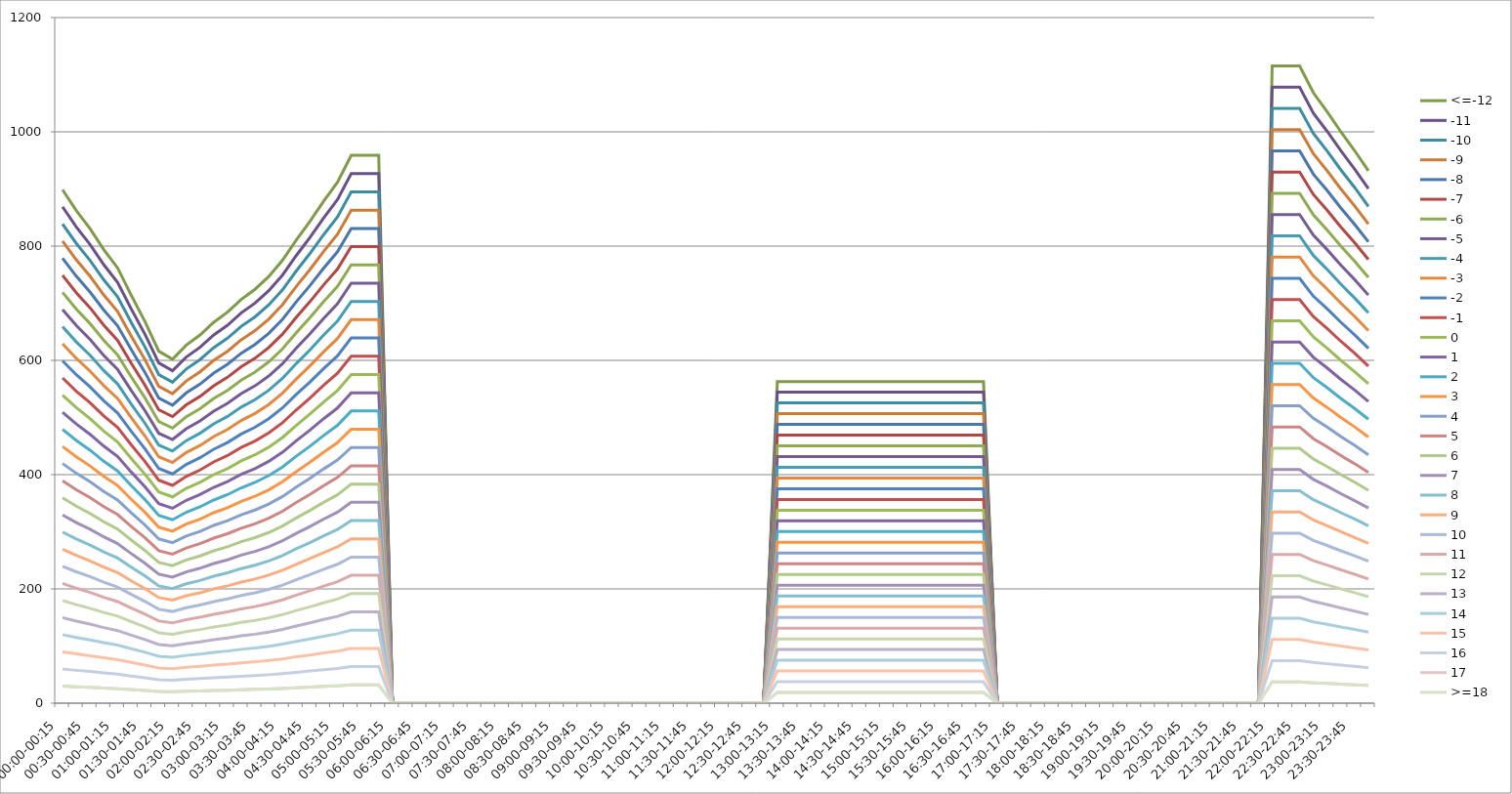
| Category | <=-12 | -11 | -10 | -9 | -8 | -7 | -6 | -5 | -4 | -3 | -2 | -1 | 0 | 1 | 2 | 3 | 4 | 5 | 6 | 7 | 8 | 9 | 10 | 11 | 12 | 13 | 14 | 15 | 16 | 17 | >=18 |
|---|---|---|---|---|---|---|---|---|---|---|---|---|---|---|---|---|---|---|---|---|---|---|---|---|---|---|---|---|---|---|---|
| 00:00-00:15 | 898.734 | 868.776 | 838.818 | 808.86 | 778.903 | 748.945 | 718.987 | 689.029 | 659.071 | 629.114 | 599.156 | 569.198 | 539.24 | 509.282 | 479.325 | 449.367 | 419.409 | 389.451 | 359.494 | 329.536 | 299.578 | 269.62 | 239.662 | 209.705 | 179.747 | 149.789 | 119.831 | 89.873 | 59.916 | 29.958 | 29.958 |
| 00:15-00:30 | 862.219 | 833.478 | 804.738 | 775.997 | 747.256 | 718.516 | 689.775 | 661.035 | 632.294 | 603.553 | 574.813 | 546.072 | 517.331 | 488.591 | 459.85 | 431.11 | 402.369 | 373.628 | 344.888 | 316.147 | 287.406 | 258.666 | 229.925 | 201.184 | 172.444 | 143.703 | 114.963 | 86.222 | 57.481 | 28.741 | 28.741 |
| 00:30-00:45 | 830.416 | 802.735 | 775.055 | 747.374 | 719.694 | 692.013 | 664.333 | 636.652 | 608.972 | 581.291 | 553.611 | 525.93 | 498.25 | 470.569 | 442.888 | 415.208 | 387.527 | 359.847 | 332.166 | 304.486 | 276.805 | 249.125 | 221.444 | 193.764 | 166.083 | 138.403 | 110.722 | 83.042 | 55.361 | 27.681 | 27.681 |
| 00:45-01:00 | 793.901 | 767.438 | 740.974 | 714.511 | 688.048 | 661.584 | 635.121 | 608.658 | 582.194 | 555.731 | 529.267 | 502.804 | 476.341 | 449.877 | 423.414 | 396.951 | 370.487 | 344.024 | 317.56 | 291.097 | 264.634 | 238.17 | 211.707 | 185.244 | 158.78 | 132.317 | 105.853 | 79.39 | 52.927 | 26.463 | 26.463 |
| 01:00-01:15 | 762.098 | 736.695 | 711.291 | 685.888 | 660.485 | 635.082 | 609.678 | 584.275 | 558.872 | 533.469 | 508.065 | 482.662 | 457.259 | 431.856 | 406.452 | 381.049 | 355.646 | 330.242 | 304.839 | 279.436 | 254.033 | 228.629 | 203.226 | 177.823 | 152.42 | 127.016 | 101.613 | 76.21 | 50.807 | 25.403 | 25.403 |
| 01:15-01:30 | 713.804 | 690.011 | 666.217 | 642.424 | 618.63 | 594.837 | 571.043 | 547.25 | 523.456 | 499.663 | 475.87 | 452.076 | 428.283 | 404.489 | 380.696 | 356.902 | 333.109 | 309.315 | 285.522 | 261.728 | 237.935 | 214.141 | 190.348 | 166.554 | 142.761 | 118.967 | 95.174 | 71.38 | 47.587 | 23.793 | 23.793 |
| 01:30-01:45 | 667.866 | 645.604 | 623.342 | 601.08 | 578.818 | 556.555 | 534.293 | 512.031 | 489.769 | 467.506 | 445.244 | 422.982 | 400.72 | 378.458 | 356.195 | 333.933 | 311.671 | 289.409 | 267.147 | 244.884 | 222.622 | 200.36 | 178.098 | 155.835 | 133.573 | 111.311 | 89.049 | 66.787 | 44.524 | 22.262 | 22.262 |
| 01:45-02:00 | 616.039 | 595.504 | 574.97 | 554.435 | 533.9 | 513.366 | 492.831 | 472.297 | 451.762 | 431.227 | 410.693 | 390.158 | 369.623 | 349.089 | 328.554 | 308.02 | 287.485 | 266.95 | 246.416 | 225.881 | 205.346 | 184.812 | 164.277 | 143.742 | 123.208 | 102.673 | 82.139 | 61.604 | 41.069 | 20.535 | 20.535 |
| 02:00-02:15 | 601.904 | 581.841 | 561.777 | 541.714 | 521.65 | 501.587 | 481.523 | 461.46 | 441.396 | 421.333 | 401.27 | 381.206 | 361.143 | 341.079 | 321.016 | 300.952 | 280.889 | 260.825 | 240.762 | 220.698 | 200.635 | 180.571 | 160.508 | 140.444 | 120.381 | 100.317 | 80.254 | 60.19 | 40.127 | 20.063 | 20.063 |
| 02:15-02:30 | 626.64 | 605.752 | 584.864 | 563.976 | 543.088 | 522.2 | 501.312 | 480.424 | 459.536 | 438.648 | 417.76 | 396.872 | 375.984 | 355.096 | 334.208 | 313.32 | 292.432 | 271.544 | 250.656 | 229.768 | 208.88 | 187.992 | 167.104 | 146.216 | 125.328 | 104.44 | 83.552 | 62.664 | 41.776 | 20.888 | 20.888 |
| 02:30-02:45 | 644.308 | 622.832 | 601.355 | 579.878 | 558.401 | 536.924 | 515.447 | 493.97 | 472.493 | 451.016 | 429.539 | 408.062 | 386.585 | 365.108 | 343.631 | 322.154 | 300.677 | 279.2 | 257.723 | 236.246 | 214.769 | 193.293 | 171.816 | 150.339 | 128.862 | 107.385 | 85.908 | 64.431 | 42.954 | 21.477 | 21.477 |
| 02:45-03:00 | 666.688 | 644.466 | 622.243 | 600.02 | 577.797 | 555.574 | 533.351 | 511.128 | 488.905 | 466.682 | 444.459 | 422.236 | 400.013 | 377.79 | 355.567 | 333.344 | 311.121 | 288.898 | 266.675 | 244.452 | 222.229 | 200.007 | 177.784 | 155.561 | 133.338 | 111.115 | 88.892 | 66.669 | 44.446 | 22.223 | 22.223 |
| 03:00-03:15 | 684.357 | 661.545 | 638.733 | 615.921 | 593.109 | 570.297 | 547.486 | 524.674 | 501.862 | 479.05 | 456.238 | 433.426 | 410.614 | 387.802 | 364.99 | 342.178 | 319.367 | 296.555 | 273.743 | 250.931 | 228.119 | 205.307 | 182.495 | 159.683 | 136.871 | 114.059 | 91.248 | 68.436 | 45.624 | 22.812 | 22.812 |
| 03:15-03:30 | 706.737 | 683.179 | 659.621 | 636.063 | 612.505 | 588.947 | 565.39 | 541.832 | 518.274 | 494.716 | 471.158 | 447.6 | 424.042 | 400.484 | 376.926 | 353.368 | 329.811 | 306.253 | 282.695 | 259.137 | 235.579 | 212.021 | 188.463 | 164.905 | 141.347 | 117.789 | 94.232 | 70.674 | 47.116 | 23.558 | 23.558 |
| 03:30-03:45 | 724.405 | 700.258 | 676.112 | 651.965 | 627.818 | 603.671 | 579.524 | 555.377 | 531.231 | 507.084 | 482.937 | 458.79 | 434.643 | 410.496 | 386.35 | 362.203 | 338.056 | 313.909 | 289.762 | 265.615 | 241.468 | 217.322 | 193.175 | 169.028 | 144.881 | 120.734 | 96.587 | 72.441 | 48.294 | 24.147 | 24.147 |
| 03:45-04:00 | 746.785 | 721.892 | 697 | 672.107 | 647.214 | 622.321 | 597.428 | 572.535 | 547.643 | 522.75 | 497.857 | 472.964 | 448.071 | 423.178 | 398.286 | 373.393 | 348.5 | 323.607 | 298.714 | 273.821 | 248.928 | 224.036 | 199.143 | 174.25 | 149.357 | 124.464 | 99.571 | 74.679 | 49.786 | 24.893 | 24.893 |
| 04:00-04:15 | 775.055 | 749.22 | 723.384 | 697.549 | 671.714 | 645.879 | 620.044 | 594.209 | 568.374 | 542.538 | 516.703 | 490.868 | 465.033 | 439.198 | 413.363 | 387.527 | 361.692 | 335.857 | 310.022 | 284.187 | 258.352 | 232.516 | 206.681 | 180.846 | 155.011 | 129.176 | 103.341 | 77.505 | 51.67 | 25.835 | 25.835 |
| 04:15-04:30 | 810.392 | 783.379 | 756.366 | 729.352 | 702.339 | 675.326 | 648.313 | 621.3 | 594.287 | 567.274 | 540.261 | 513.248 | 486.235 | 459.222 | 432.209 | 405.196 | 378.183 | 351.17 | 324.157 | 297.144 | 270.131 | 243.117 | 216.104 | 189.091 | 162.078 | 135.065 | 108.052 | 81.039 | 54.026 | 27.013 | 27.013 |
| 04:30-04:45 | 843.373 | 815.26 | 787.148 | 759.035 | 730.923 | 702.811 | 674.698 | 646.586 | 618.473 | 590.361 | 562.248 | 534.136 | 506.024 | 477.911 | 449.799 | 421.686 | 393.574 | 365.462 | 337.349 | 309.237 | 281.124 | 253.012 | 224.899 | 196.787 | 168.675 | 140.562 | 112.45 | 84.337 | 56.225 | 28.112 | 28.112 |
| 04:45-05:00 | 878.71 | 849.419 | 820.129 | 790.839 | 761.548 | 732.258 | 702.968 | 673.677 | 644.387 | 615.097 | 585.806 | 556.516 | 527.226 | 497.935 | 468.645 | 439.355 | 410.064 | 380.774 | 351.484 | 322.194 | 292.903 | 263.613 | 234.323 | 205.032 | 175.742 | 146.452 | 117.161 | 87.871 | 58.581 | 29.29 | 29.29 |
| 05:00-05:15 | 911.691 | 881.301 | 850.911 | 820.522 | 790.132 | 759.742 | 729.352 | 698.963 | 668.573 | 638.183 | 607.794 | 577.404 | 547.014 | 516.625 | 486.235 | 455.845 | 425.456 | 395.066 | 364.676 | 334.287 | 303.897 | 273.507 | 243.117 | 212.728 | 182.338 | 151.948 | 121.559 | 91.169 | 60.779 | 30.39 | 30.39 |
| 05:15-05:30 | 958.806 | 926.846 | 894.886 | 862.926 | 830.966 | 799.005 | 767.045 | 735.085 | 703.125 | 671.164 | 639.204 | 607.244 | 575.284 | 543.324 | 511.363 | 479.403 | 447.443 | 415.483 | 383.523 | 351.562 | 319.602 | 287.642 | 255.682 | 223.721 | 191.761 | 159.801 | 127.841 | 95.881 | 63.92 | 31.96 | 31.96 |
| 05:30-05:45 | 958.806 | 926.846 | 894.886 | 862.926 | 830.966 | 799.005 | 767.045 | 735.085 | 703.125 | 671.164 | 639.204 | 607.244 | 575.284 | 543.324 | 511.363 | 479.403 | 447.443 | 415.483 | 383.523 | 351.562 | 319.602 | 287.642 | 255.682 | 223.721 | 191.761 | 159.801 | 127.841 | 95.881 | 63.92 | 31.96 | 31.96 |
| 05:45-06:00 | 958.806 | 926.846 | 894.886 | 862.926 | 830.966 | 799.005 | 767.045 | 735.085 | 703.125 | 671.164 | 639.204 | 607.244 | 575.284 | 543.324 | 511.363 | 479.403 | 447.443 | 415.483 | 383.523 | 351.562 | 319.602 | 287.642 | 255.682 | 223.721 | 191.761 | 159.801 | 127.841 | 95.881 | 63.92 | 31.96 | 31.96 |
| 06:00-06:15 | 0 | 0 | 0 | 0 | 0 | 0 | 0 | 0 | 0 | 0 | 0 | 0 | 0 | 0 | 0 | 0 | 0 | 0 | 0 | 0 | 0 | 0 | 0 | 0 | 0 | 0 | 0 | 0 | 0 | 0 | 0 |
| 06:15-06:30 | 0 | 0 | 0 | 0 | 0 | 0 | 0 | 0 | 0 | 0 | 0 | 0 | 0 | 0 | 0 | 0 | 0 | 0 | 0 | 0 | 0 | 0 | 0 | 0 | 0 | 0 | 0 | 0 | 0 | 0 | 0 |
| 06:30-06:45 | 0 | 0 | 0 | 0 | 0 | 0 | 0 | 0 | 0 | 0 | 0 | 0 | 0 | 0 | 0 | 0 | 0 | 0 | 0 | 0 | 0 | 0 | 0 | 0 | 0 | 0 | 0 | 0 | 0 | 0 | 0 |
| 06:45-07:00 | 0 | 0 | 0 | 0 | 0 | 0 | 0 | 0 | 0 | 0 | 0 | 0 | 0 | 0 | 0 | 0 | 0 | 0 | 0 | 0 | 0 | 0 | 0 | 0 | 0 | 0 | 0 | 0 | 0 | 0 | 0 |
| 07:00-07:15 | 0 | 0 | 0 | 0 | 0 | 0 | 0 | 0 | 0 | 0 | 0 | 0 | 0 | 0 | 0 | 0 | 0 | 0 | 0 | 0 | 0 | 0 | 0 | 0 | 0 | 0 | 0 | 0 | 0 | 0 | 0 |
| 07:15-07:30 | 0 | 0 | 0 | 0 | 0 | 0 | 0 | 0 | 0 | 0 | 0 | 0 | 0 | 0 | 0 | 0 | 0 | 0 | 0 | 0 | 0 | 0 | 0 | 0 | 0 | 0 | 0 | 0 | 0 | 0 | 0 |
| 07:30-07:45 | 0 | 0 | 0 | 0 | 0 | 0 | 0 | 0 | 0 | 0 | 0 | 0 | 0 | 0 | 0 | 0 | 0 | 0 | 0 | 0 | 0 | 0 | 0 | 0 | 0 | 0 | 0 | 0 | 0 | 0 | 0 |
| 07:45-08:00 | 0 | 0 | 0 | 0 | 0 | 0 | 0 | 0 | 0 | 0 | 0 | 0 | 0 | 0 | 0 | 0 | 0 | 0 | 0 | 0 | 0 | 0 | 0 | 0 | 0 | 0 | 0 | 0 | 0 | 0 | 0 |
| 08:00-08:15 | 0 | 0 | 0 | 0 | 0 | 0 | 0 | 0 | 0 | 0 | 0 | 0 | 0 | 0 | 0 | 0 | 0 | 0 | 0 | 0 | 0 | 0 | 0 | 0 | 0 | 0 | 0 | 0 | 0 | 0 | 0 |
| 08:15-08:30 | 0 | 0 | 0 | 0 | 0 | 0 | 0 | 0 | 0 | 0 | 0 | 0 | 0 | 0 | 0 | 0 | 0 | 0 | 0 | 0 | 0 | 0 | 0 | 0 | 0 | 0 | 0 | 0 | 0 | 0 | 0 |
| 08:30-08:45 | 0 | 0 | 0 | 0 | 0 | 0 | 0 | 0 | 0 | 0 | 0 | 0 | 0 | 0 | 0 | 0 | 0 | 0 | 0 | 0 | 0 | 0 | 0 | 0 | 0 | 0 | 0 | 0 | 0 | 0 | 0 |
| 08:45-09:00 | 0 | 0 | 0 | 0 | 0 | 0 | 0 | 0 | 0 | 0 | 0 | 0 | 0 | 0 | 0 | 0 | 0 | 0 | 0 | 0 | 0 | 0 | 0 | 0 | 0 | 0 | 0 | 0 | 0 | 0 | 0 |
| 09:00-09:15 | 0 | 0 | 0 | 0 | 0 | 0 | 0 | 0 | 0 | 0 | 0 | 0 | 0 | 0 | 0 | 0 | 0 | 0 | 0 | 0 | 0 | 0 | 0 | 0 | 0 | 0 | 0 | 0 | 0 | 0 | 0 |
| 09:15-09:30 | 0 | 0 | 0 | 0 | 0 | 0 | 0 | 0 | 0 | 0 | 0 | 0 | 0 | 0 | 0 | 0 | 0 | 0 | 0 | 0 | 0 | 0 | 0 | 0 | 0 | 0 | 0 | 0 | 0 | 0 | 0 |
| 09:30-09:45 | 0 | 0 | 0 | 0 | 0 | 0 | 0 | 0 | 0 | 0 | 0 | 0 | 0 | 0 | 0 | 0 | 0 | 0 | 0 | 0 | 0 | 0 | 0 | 0 | 0 | 0 | 0 | 0 | 0 | 0 | 0 |
| 09:45-10:00 | 0 | 0 | 0 | 0 | 0 | 0 | 0 | 0 | 0 | 0 | 0 | 0 | 0 | 0 | 0 | 0 | 0 | 0 | 0 | 0 | 0 | 0 | 0 | 0 | 0 | 0 | 0 | 0 | 0 | 0 | 0 |
| 10:00-10:15 | 0 | 0 | 0 | 0 | 0 | 0 | 0 | 0 | 0 | 0 | 0 | 0 | 0 | 0 | 0 | 0 | 0 | 0 | 0 | 0 | 0 | 0 | 0 | 0 | 0 | 0 | 0 | 0 | 0 | 0 | 0 |
| 10:15-10:30 | 0 | 0 | 0 | 0 | 0 | 0 | 0 | 0 | 0 | 0 | 0 | 0 | 0 | 0 | 0 | 0 | 0 | 0 | 0 | 0 | 0 | 0 | 0 | 0 | 0 | 0 | 0 | 0 | 0 | 0 | 0 |
| 10:30-10:45 | 0 | 0 | 0 | 0 | 0 | 0 | 0 | 0 | 0 | 0 | 0 | 0 | 0 | 0 | 0 | 0 | 0 | 0 | 0 | 0 | 0 | 0 | 0 | 0 | 0 | 0 | 0 | 0 | 0 | 0 | 0 |
| 10:45-11:00 | 0 | 0 | 0 | 0 | 0 | 0 | 0 | 0 | 0 | 0 | 0 | 0 | 0 | 0 | 0 | 0 | 0 | 0 | 0 | 0 | 0 | 0 | 0 | 0 | 0 | 0 | 0 | 0 | 0 | 0 | 0 |
| 11:00-11:15 | 0 | 0 | 0 | 0 | 0 | 0 | 0 | 0 | 0 | 0 | 0 | 0 | 0 | 0 | 0 | 0 | 0 | 0 | 0 | 0 | 0 | 0 | 0 | 0 | 0 | 0 | 0 | 0 | 0 | 0 | 0 |
| 11:15-11:30 | 0 | 0 | 0 | 0 | 0 | 0 | 0 | 0 | 0 | 0 | 0 | 0 | 0 | 0 | 0 | 0 | 0 | 0 | 0 | 0 | 0 | 0 | 0 | 0 | 0 | 0 | 0 | 0 | 0 | 0 | 0 |
| 11:30-11:45 | 0 | 0 | 0 | 0 | 0 | 0 | 0 | 0 | 0 | 0 | 0 | 0 | 0 | 0 | 0 | 0 | 0 | 0 | 0 | 0 | 0 | 0 | 0 | 0 | 0 | 0 | 0 | 0 | 0 | 0 | 0 |
| 11:45-12:00 | 0 | 0 | 0 | 0 | 0 | 0 | 0 | 0 | 0 | 0 | 0 | 0 | 0 | 0 | 0 | 0 | 0 | 0 | 0 | 0 | 0 | 0 | 0 | 0 | 0 | 0 | 0 | 0 | 0 | 0 | 0 |
| 12:00-12:15 | 0 | 0 | 0 | 0 | 0 | 0 | 0 | 0 | 0 | 0 | 0 | 0 | 0 | 0 | 0 | 0 | 0 | 0 | 0 | 0 | 0 | 0 | 0 | 0 | 0 | 0 | 0 | 0 | 0 | 0 | 0 |
| 12:15-12:30 | 0 | 0 | 0 | 0 | 0 | 0 | 0 | 0 | 0 | 0 | 0 | 0 | 0 | 0 | 0 | 0 | 0 | 0 | 0 | 0 | 0 | 0 | 0 | 0 | 0 | 0 | 0 | 0 | 0 | 0 | 0 |
| 12:30-12:45 | 0 | 0 | 0 | 0 | 0 | 0 | 0 | 0 | 0 | 0 | 0 | 0 | 0 | 0 | 0 | 0 | 0 | 0 | 0 | 0 | 0 | 0 | 0 | 0 | 0 | 0 | 0 | 0 | 0 | 0 | 0 |
| 12:45-13:00 | 0 | 0 | 0 | 0 | 0 | 0 | 0 | 0 | 0 | 0 | 0 | 0 | 0 | 0 | 0 | 0 | 0 | 0 | 0 | 0 | 0 | 0 | 0 | 0 | 0 | 0 | 0 | 0 | 0 | 0 | 0 |
| 13:00-13:15 | 563.034 | 544.266 | 525.498 | 506.73 | 487.963 | 469.195 | 450.427 | 431.659 | 412.891 | 394.124 | 375.356 | 356.588 | 337.82 | 319.052 | 300.285 | 281.517 | 262.749 | 243.981 | 225.213 | 206.446 | 187.678 | 168.91 | 150.142 | 131.375 | 112.607 | 93.839 | 75.071 | 56.303 | 37.536 | 18.768 | 18.768 |
| 13:15-13:30 | 563.034 | 544.266 | 525.498 | 506.73 | 487.963 | 469.195 | 450.427 | 431.659 | 412.891 | 394.124 | 375.356 | 356.588 | 337.82 | 319.052 | 300.285 | 281.517 | 262.749 | 243.981 | 225.213 | 206.446 | 187.678 | 168.91 | 150.142 | 131.375 | 112.607 | 93.839 | 75.071 | 56.303 | 37.536 | 18.768 | 18.768 |
| 13:30-13:45 | 563.034 | 544.266 | 525.498 | 506.73 | 487.963 | 469.195 | 450.427 | 431.659 | 412.891 | 394.124 | 375.356 | 356.588 | 337.82 | 319.052 | 300.285 | 281.517 | 262.749 | 243.981 | 225.213 | 206.446 | 187.678 | 168.91 | 150.142 | 131.375 | 112.607 | 93.839 | 75.071 | 56.303 | 37.536 | 18.768 | 18.768 |
| 13:45-14:00 | 563.034 | 544.266 | 525.498 | 506.73 | 487.963 | 469.195 | 450.427 | 431.659 | 412.891 | 394.124 | 375.356 | 356.588 | 337.82 | 319.052 | 300.285 | 281.517 | 262.749 | 243.981 | 225.213 | 206.446 | 187.678 | 168.91 | 150.142 | 131.375 | 112.607 | 93.839 | 75.071 | 56.303 | 37.536 | 18.768 | 18.768 |
| 14:00-14:15 | 563.034 | 544.266 | 525.498 | 506.73 | 487.963 | 469.195 | 450.427 | 431.659 | 412.891 | 394.124 | 375.356 | 356.588 | 337.82 | 319.052 | 300.285 | 281.517 | 262.749 | 243.981 | 225.213 | 206.446 | 187.678 | 168.91 | 150.142 | 131.375 | 112.607 | 93.839 | 75.071 | 56.303 | 37.536 | 18.768 | 18.768 |
| 14:15-14:30 | 563.034 | 544.266 | 525.498 | 506.73 | 487.963 | 469.195 | 450.427 | 431.659 | 412.891 | 394.124 | 375.356 | 356.588 | 337.82 | 319.052 | 300.285 | 281.517 | 262.749 | 243.981 | 225.213 | 206.446 | 187.678 | 168.91 | 150.142 | 131.375 | 112.607 | 93.839 | 75.071 | 56.303 | 37.536 | 18.768 | 18.768 |
| 14:30-14:45 | 563.034 | 544.266 | 525.498 | 506.73 | 487.963 | 469.195 | 450.427 | 431.659 | 412.891 | 394.124 | 375.356 | 356.588 | 337.82 | 319.052 | 300.285 | 281.517 | 262.749 | 243.981 | 225.213 | 206.446 | 187.678 | 168.91 | 150.142 | 131.375 | 112.607 | 93.839 | 75.071 | 56.303 | 37.536 | 18.768 | 18.768 |
| 14:45-15:00 | 563.034 | 544.266 | 525.498 | 506.73 | 487.963 | 469.195 | 450.427 | 431.659 | 412.891 | 394.124 | 375.356 | 356.588 | 337.82 | 319.052 | 300.285 | 281.517 | 262.749 | 243.981 | 225.213 | 206.446 | 187.678 | 168.91 | 150.142 | 131.375 | 112.607 | 93.839 | 75.071 | 56.303 | 37.536 | 18.768 | 18.768 |
| 15:00-15:15 | 563.034 | 544.266 | 525.498 | 506.73 | 487.963 | 469.195 | 450.427 | 431.659 | 412.891 | 394.124 | 375.356 | 356.588 | 337.82 | 319.052 | 300.285 | 281.517 | 262.749 | 243.981 | 225.213 | 206.446 | 187.678 | 168.91 | 150.142 | 131.375 | 112.607 | 93.839 | 75.071 | 56.303 | 37.536 | 18.768 | 18.768 |
| 15:15-15:30 | 563.034 | 544.266 | 525.498 | 506.73 | 487.963 | 469.195 | 450.427 | 431.659 | 412.891 | 394.124 | 375.356 | 356.588 | 337.82 | 319.052 | 300.285 | 281.517 | 262.749 | 243.981 | 225.213 | 206.446 | 187.678 | 168.91 | 150.142 | 131.375 | 112.607 | 93.839 | 75.071 | 56.303 | 37.536 | 18.768 | 18.768 |
| 15:30-15:45 | 563.034 | 544.266 | 525.498 | 506.73 | 487.963 | 469.195 | 450.427 | 431.659 | 412.891 | 394.124 | 375.356 | 356.588 | 337.82 | 319.052 | 300.285 | 281.517 | 262.749 | 243.981 | 225.213 | 206.446 | 187.678 | 168.91 | 150.142 | 131.375 | 112.607 | 93.839 | 75.071 | 56.303 | 37.536 | 18.768 | 18.768 |
| 15:45-16:00 | 563.034 | 544.266 | 525.498 | 506.73 | 487.963 | 469.195 | 450.427 | 431.659 | 412.891 | 394.124 | 375.356 | 356.588 | 337.82 | 319.052 | 300.285 | 281.517 | 262.749 | 243.981 | 225.213 | 206.446 | 187.678 | 168.91 | 150.142 | 131.375 | 112.607 | 93.839 | 75.071 | 56.303 | 37.536 | 18.768 | 18.768 |
| 16:00-16:15 | 563.034 | 544.266 | 525.498 | 506.73 | 487.963 | 469.195 | 450.427 | 431.659 | 412.891 | 394.124 | 375.356 | 356.588 | 337.82 | 319.052 | 300.285 | 281.517 | 262.749 | 243.981 | 225.213 | 206.446 | 187.678 | 168.91 | 150.142 | 131.375 | 112.607 | 93.839 | 75.071 | 56.303 | 37.536 | 18.768 | 18.768 |
| 16:15-16:30 | 563.034 | 544.266 | 525.498 | 506.73 | 487.963 | 469.195 | 450.427 | 431.659 | 412.891 | 394.124 | 375.356 | 356.588 | 337.82 | 319.052 | 300.285 | 281.517 | 262.749 | 243.981 | 225.213 | 206.446 | 187.678 | 168.91 | 150.142 | 131.375 | 112.607 | 93.839 | 75.071 | 56.303 | 37.536 | 18.768 | 18.768 |
| 16:30-16:45 | 563.034 | 544.266 | 525.498 | 506.73 | 487.963 | 469.195 | 450.427 | 431.659 | 412.891 | 394.124 | 375.356 | 356.588 | 337.82 | 319.052 | 300.285 | 281.517 | 262.749 | 243.981 | 225.213 | 206.446 | 187.678 | 168.91 | 150.142 | 131.375 | 112.607 | 93.839 | 75.071 | 56.303 | 37.536 | 18.768 | 18.768 |
| 16:45-17:00 | 563.034 | 544.266 | 525.498 | 506.73 | 487.963 | 469.195 | 450.427 | 431.659 | 412.891 | 394.124 | 375.356 | 356.588 | 337.82 | 319.052 | 300.285 | 281.517 | 262.749 | 243.981 | 225.213 | 206.446 | 187.678 | 168.91 | 150.142 | 131.375 | 112.607 | 93.839 | 75.071 | 56.303 | 37.536 | 18.768 | 18.768 |
| 17:00-17:15 | 0 | 0 | 0 | 0 | 0 | 0 | 0 | 0 | 0 | 0 | 0 | 0 | 0 | 0 | 0 | 0 | 0 | 0 | 0 | 0 | 0 | 0 | 0 | 0 | 0 | 0 | 0 | 0 | 0 | 0 | 0 |
| 17:15-17:30 | 0 | 0 | 0 | 0 | 0 | 0 | 0 | 0 | 0 | 0 | 0 | 0 | 0 | 0 | 0 | 0 | 0 | 0 | 0 | 0 | 0 | 0 | 0 | 0 | 0 | 0 | 0 | 0 | 0 | 0 | 0 |
| 17:30-17:45 | 0 | 0 | 0 | 0 | 0 | 0 | 0 | 0 | 0 | 0 | 0 | 0 | 0 | 0 | 0 | 0 | 0 | 0 | 0 | 0 | 0 | 0 | 0 | 0 | 0 | 0 | 0 | 0 | 0 | 0 | 0 |
| 17:45-18:00 | 0 | 0 | 0 | 0 | 0 | 0 | 0 | 0 | 0 | 0 | 0 | 0 | 0 | 0 | 0 | 0 | 0 | 0 | 0 | 0 | 0 | 0 | 0 | 0 | 0 | 0 | 0 | 0 | 0 | 0 | 0 |
| 18:00-18:15 | 0 | 0 | 0 | 0 | 0 | 0 | 0 | 0 | 0 | 0 | 0 | 0 | 0 | 0 | 0 | 0 | 0 | 0 | 0 | 0 | 0 | 0 | 0 | 0 | 0 | 0 | 0 | 0 | 0 | 0 | 0 |
| 18:15-18:30 | 0 | 0 | 0 | 0 | 0 | 0 | 0 | 0 | 0 | 0 | 0 | 0 | 0 | 0 | 0 | 0 | 0 | 0 | 0 | 0 | 0 | 0 | 0 | 0 | 0 | 0 | 0 | 0 | 0 | 0 | 0 |
| 18:30-18:45 | 0 | 0 | 0 | 0 | 0 | 0 | 0 | 0 | 0 | 0 | 0 | 0 | 0 | 0 | 0 | 0 | 0 | 0 | 0 | 0 | 0 | 0 | 0 | 0 | 0 | 0 | 0 | 0 | 0 | 0 | 0 |
| 18:45-19:00 | 0 | 0 | 0 | 0 | 0 | 0 | 0 | 0 | 0 | 0 | 0 | 0 | 0 | 0 | 0 | 0 | 0 | 0 | 0 | 0 | 0 | 0 | 0 | 0 | 0 | 0 | 0 | 0 | 0 | 0 | 0 |
| 19:00-19:15 | 0 | 0 | 0 | 0 | 0 | 0 | 0 | 0 | 0 | 0 | 0 | 0 | 0 | 0 | 0 | 0 | 0 | 0 | 0 | 0 | 0 | 0 | 0 | 0 | 0 | 0 | 0 | 0 | 0 | 0 | 0 |
| 19:15-19:30 | 0 | 0 | 0 | 0 | 0 | 0 | 0 | 0 | 0 | 0 | 0 | 0 | 0 | 0 | 0 | 0 | 0 | 0 | 0 | 0 | 0 | 0 | 0 | 0 | 0 | 0 | 0 | 0 | 0 | 0 | 0 |
| 19:30-19:45 | 0 | 0 | 0 | 0 | 0 | 0 | 0 | 0 | 0 | 0 | 0 | 0 | 0 | 0 | 0 | 0 | 0 | 0 | 0 | 0 | 0 | 0 | 0 | 0 | 0 | 0 | 0 | 0 | 0 | 0 | 0 |
| 19:45-20:00 | 0 | 0 | 0 | 0 | 0 | 0 | 0 | 0 | 0 | 0 | 0 | 0 | 0 | 0 | 0 | 0 | 0 | 0 | 0 | 0 | 0 | 0 | 0 | 0 | 0 | 0 | 0 | 0 | 0 | 0 | 0 |
| 20:00-20:15 | 0 | 0 | 0 | 0 | 0 | 0 | 0 | 0 | 0 | 0 | 0 | 0 | 0 | 0 | 0 | 0 | 0 | 0 | 0 | 0 | 0 | 0 | 0 | 0 | 0 | 0 | 0 | 0 | 0 | 0 | 0 |
| 20:15-20:30 | 0 | 0 | 0 | 0 | 0 | 0 | 0 | 0 | 0 | 0 | 0 | 0 | 0 | 0 | 0 | 0 | 0 | 0 | 0 | 0 | 0 | 0 | 0 | 0 | 0 | 0 | 0 | 0 | 0 | 0 | 0 |
| 20:30-20:45 | 0 | 0 | 0 | 0 | 0 | 0 | 0 | 0 | 0 | 0 | 0 | 0 | 0 | 0 | 0 | 0 | 0 | 0 | 0 | 0 | 0 | 0 | 0 | 0 | 0 | 0 | 0 | 0 | 0 | 0 | 0 |
| 20:45-21:00 | 0 | 0 | 0 | 0 | 0 | 0 | 0 | 0 | 0 | 0 | 0 | 0 | 0 | 0 | 0 | 0 | 0 | 0 | 0 | 0 | 0 | 0 | 0 | 0 | 0 | 0 | 0 | 0 | 0 | 0 | 0 |
| 21:00-21:15 | 0 | 0 | 0 | 0 | 0 | 0 | 0 | 0 | 0 | 0 | 0 | 0 | 0 | 0 | 0 | 0 | 0 | 0 | 0 | 0 | 0 | 0 | 0 | 0 | 0 | 0 | 0 | 0 | 0 | 0 | 0 |
| 21:15-21:30 | 0 | 0 | 0 | 0 | 0 | 0 | 0 | 0 | 0 | 0 | 0 | 0 | 0 | 0 | 0 | 0 | 0 | 0 | 0 | 0 | 0 | 0 | 0 | 0 | 0 | 0 | 0 | 0 | 0 | 0 | 0 |
| 21:30-21:45 | 0 | 0 | 0 | 0 | 0 | 0 | 0 | 0 | 0 | 0 | 0 | 0 | 0 | 0 | 0 | 0 | 0 | 0 | 0 | 0 | 0 | 0 | 0 | 0 | 0 | 0 | 0 | 0 | 0 | 0 | 0 |
| 21:45-22:00 | 0 | 0 | 0 | 0 | 0 | 0 | 0 | 0 | 0 | 0 | 0 | 0 | 0 | 0 | 0 | 0 | 0 | 0 | 0 | 0 | 0 | 0 | 0 | 0 | 0 | 0 | 0 | 0 | 0 | 0 | 0 |
| 22:00-22:15 | 1115.466 | 1078.284 | 1041.102 | 1003.92 | 966.738 | 929.555 | 892.373 | 855.191 | 818.009 | 780.826 | 743.644 | 706.462 | 669.28 | 632.098 | 594.915 | 557.733 | 520.551 | 483.369 | 446.187 | 409.004 | 371.822 | 334.64 | 297.458 | 260.275 | 223.093 | 185.911 | 148.729 | 111.547 | 74.364 | 37.182 | 37.182 |
| 22:15-22:30 | 1115.466 | 1078.284 | 1041.102 | 1003.92 | 966.738 | 929.555 | 892.373 | 855.191 | 818.009 | 780.826 | 743.644 | 706.462 | 669.28 | 632.098 | 594.915 | 557.733 | 520.551 | 483.369 | 446.187 | 409.004 | 371.822 | 334.64 | 297.458 | 260.275 | 223.093 | 185.911 | 148.729 | 111.547 | 74.364 | 37.182 | 37.182 |
| 22:30-22:45 | 1115.466 | 1078.284 | 1041.102 | 1003.92 | 966.738 | 929.555 | 892.373 | 855.191 | 818.009 | 780.826 | 743.644 | 706.462 | 669.28 | 632.098 | 594.915 | 557.733 | 520.551 | 483.369 | 446.187 | 409.004 | 371.822 | 334.64 | 297.458 | 260.275 | 223.093 | 185.911 | 148.729 | 111.547 | 74.364 | 37.182 | 37.182 |
| 22:45-23:00 | 1068.351 | 1032.739 | 997.127 | 961.516 | 925.904 | 890.292 | 854.68 | 819.069 | 783.457 | 747.845 | 712.234 | 676.622 | 641.01 | 605.399 | 569.787 | 534.175 | 498.564 | 462.952 | 427.34 | 391.729 | 356.117 | 320.505 | 284.893 | 249.282 | 213.67 | 178.058 | 142.447 | 106.835 | 71.223 | 35.612 | 35.612 |
| 23:00-23:15 | 1035.37 | 1000.857 | 966.345 | 931.833 | 897.32 | 862.808 | 828.296 | 793.783 | 759.271 | 724.759 | 690.246 | 655.734 | 621.222 | 586.709 | 552.197 | 517.685 | 483.172 | 448.66 | 414.148 | 379.636 | 345.123 | 310.611 | 276.099 | 241.586 | 207.074 | 172.562 | 138.049 | 103.537 | 69.025 | 34.512 | 34.512 |
| 23:15-23:30 | 1000.033 | 966.698 | 933.364 | 900.029 | 866.695 | 833.361 | 800.026 | 766.692 | 733.357 | 700.023 | 666.688 | 633.354 | 600.02 | 566.685 | 533.351 | 500.016 | 466.682 | 433.348 | 400.013 | 366.679 | 333.344 | 300.01 | 266.675 | 233.341 | 200.007 | 166.672 | 133.338 | 100.003 | 66.669 | 33.334 | 33.334 |
| 23:30-23:45 | 967.052 | 934.817 | 902.582 | 870.346 | 838.111 | 805.876 | 773.641 | 741.406 | 709.171 | 676.936 | 644.701 | 612.466 | 580.231 | 547.996 | 515.761 | 483.526 | 451.291 | 419.056 | 386.821 | 354.586 | 322.351 | 290.115 | 257.88 | 225.645 | 193.41 | 161.175 | 128.94 | 96.705 | 64.47 | 32.235 | 32.235 |
| 23:45-00:00 | 931.715 | 900.658 | 869.6 | 838.543 | 807.486 | 776.429 | 745.372 | 714.315 | 683.258 | 652.2 | 621.143 | 590.086 | 559.029 | 527.972 | 496.915 | 465.857 | 434.8 | 403.743 | 372.686 | 341.629 | 310.572 | 279.514 | 248.457 | 217.4 | 186.343 | 155.286 | 124.229 | 93.171 | 62.114 | 31.057 | 31.057 |